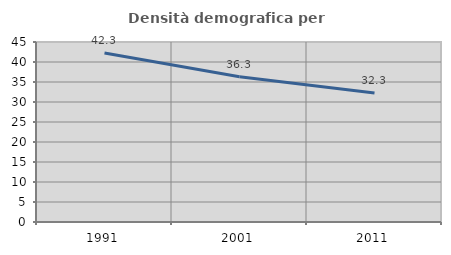
| Category | Densità demografica |
|---|---|
| 1991.0 | 42.256 |
| 2001.0 | 36.314 |
| 2011.0 | 32.269 |